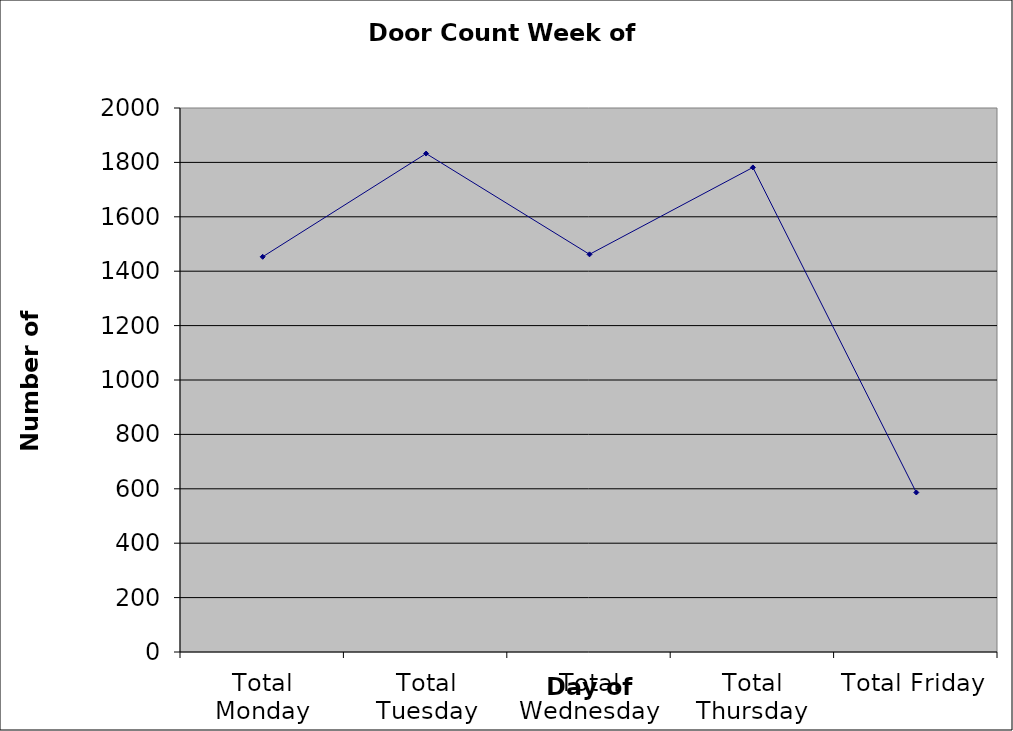
| Category | Series 0 |
|---|---|
| Total Monday | 1453 |
| Total Tuesday | 1832.5 |
| Total Wednesday | 1462 |
| Total Thursday | 1781.5 |
| Total Friday | 586.5 |